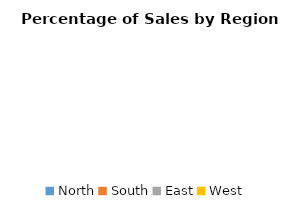
| Category | Series 0 |
|---|---|
| North | 0 |
| South | 0 |
| East | 0 |
| West | 0 |